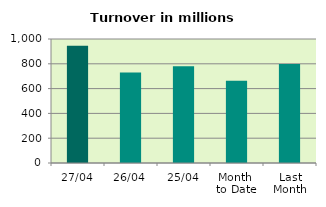
| Category | Series 0 |
|---|---|
| 27/04 | 945.256 |
| 26/04 | 730.765 |
| 25/04 | 779.245 |
| Month 
to Date | 662.717 |
| Last
Month | 798.115 |